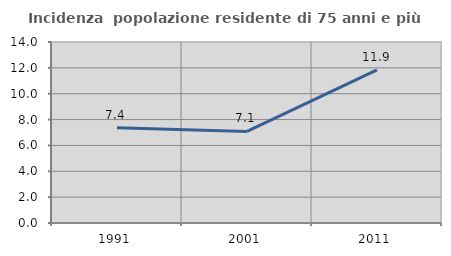
| Category | Incidenza  popolazione residente di 75 anni e più |
|---|---|
| 1991.0 | 7.363 |
| 2001.0 | 7.082 |
| 2011.0 | 11.85 |